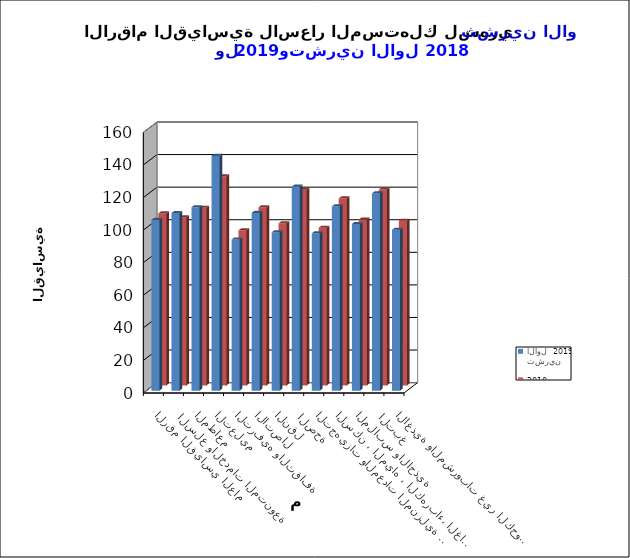
| Category | تشرين الاول  2019      |   تشرين الاول     2018 |
|---|---|---|
| الاغذية والمشروبات غير الكحولية | 98.7 | 101.1 |
|  التبغ | 121.1 | 120.3 |
| الملابس والاحذية | 102.3 | 101.8 |
| السكن ، المياه ، الكهرباء، الغاز  | 113.1 | 114.8 |
| التجهيزات والمعدات المنزلية والصيانة | 96.6 | 96.8 |
|  الصحة | 125.2 | 120.2 |
| النقل | 97.2 | 99.5 |
| الاتصال | 109.1 | 109.4 |
| الترفيه والثقافة | 92.8 | 95.2 |
| التعليم | 144.1 | 128.4 |
| المطاعم  | 112.6 | 109.1 |
|  السلع والخدمات المتنوعة | 109 | 103.2 |
| الرقم القياسي العام | 104.8 | 105.6 |